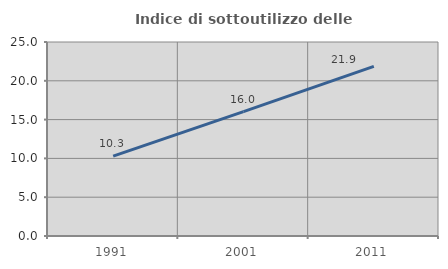
| Category | Indice di sottoutilizzo delle abitazioni  |
|---|---|
| 1991.0 | 10.284 |
| 2001.0 | 16.031 |
| 2011.0 | 21.864 |